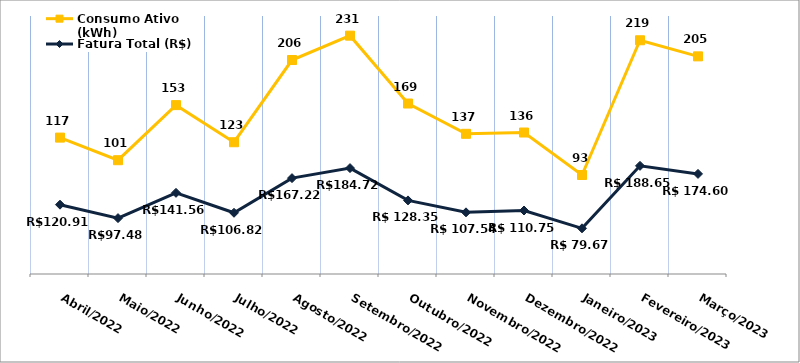
| Category | Fatura Total (R$) | Consumo Ativo (kWh) |
|---|---|---|
| Abril/2022 | 120.91 | 117 |
| Maio/2022 | 97.48 | 101 |
| Junho/2022 | 141.56 | 153 |
| Julho/2022 | 106.82 | 123 |
| Agosto/2022 | 167.22 | 206 |
| Setembro/2022 | 184.72 | 231 |
| Outubro/2022 | 128.35 | 169 |
| Novembro/2022 | 107.54 | 137 |
| Dezembro/2022 | 110.75 | 136 |
| Janeiro/2023 | 79.67 | 93 |
| Fevereiro/2023 | 188.65 | 219 |
| Março/2023 | 174.6 | 205 |